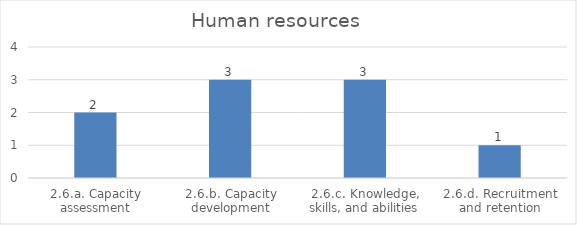
| Category | Human resources |
|---|---|
| 2.6.a. Capacity assessment | 2 |
| 2.6.b. Capacity development | 3 |
| 2.6.c. Knowledge, skills, and abilities | 3 |
| 2.6.d. Recruitment and retention | 1 |